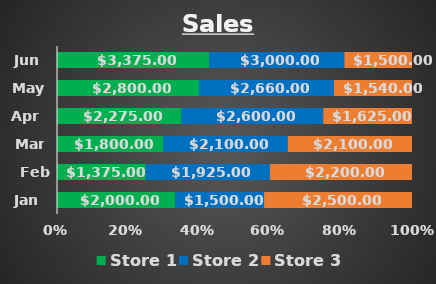
| Category | Store 1 | Store 2 | Store 3 |
|---|---|---|---|
| Jan | 2000 | 1500 | 2500 |
| Feb | 1375 | 1925 | 2200 |
| Mar | 1800 | 2100 | 2100 |
| Apr | 2275 | 2600 | 1625 |
| May | 2800 | 2660 | 1540 |
| Jun | 3375 | 3000 | 1500 |